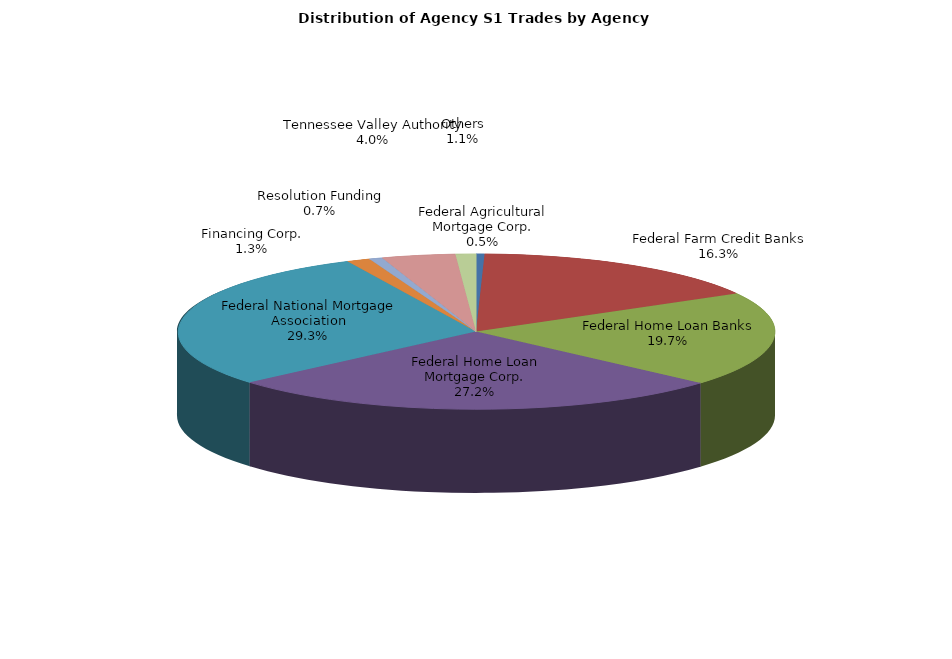
| Category | Series 0 |
|---|---|
| Federal Agricultural Mortgage Corp. | 8.936 |
| Federal Farm Credit Banks | 318.566 |
| Federal Home Loan Banks | 383.765 |
| Federal Home Loan Mortgage Corp. | 529.287 |
| Federal National Mortgage Association | 570.821 |
| Financing Corp. | 24.386 |
| Resolution Funding | 14.223 |
| Tennessee Valley Authority | 77.514 |
| Others | 21.39 |